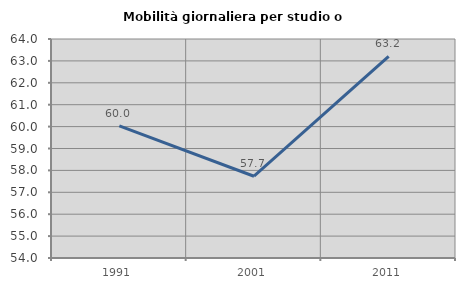
| Category | Mobilità giornaliera per studio o lavoro |
|---|---|
| 1991.0 | 60.037 |
| 2001.0 | 57.733 |
| 2011.0 | 63.21 |